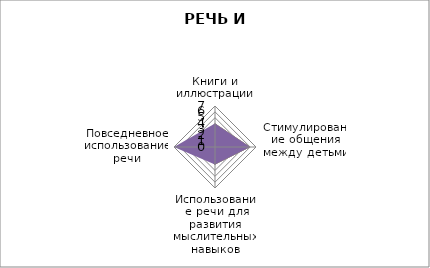
| Category | Series 0 | Series 1 | Series 2 | Series 3 |
|---|---|---|---|---|
| Книги и иллюстрации | 4 | 4 | 4 | 4 |
| Стимулирование общения между детьми | 6 | 6 | 6 | 6 |
| Использование речи для развития мыслительных навыков | 3 | 3 | 3 | 3 |
| Повседневное использование речи | 3 | 3 | 3 | 7 |